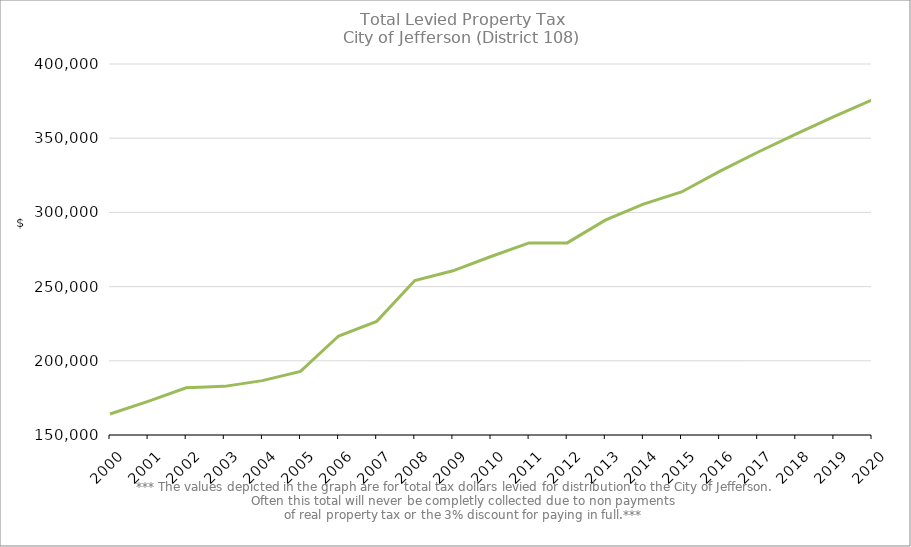
| Category | Series 0 |
|---|---|
| 2000.0 | 164131.67 |
| 2001.0 | 172702.01 |
| 2002.0 | 181807.39 |
| 2003.0 | 182772.2 |
| 2004.0 | 186646.92 |
| 2005.0 | 192885.17 |
| 2006.0 | 216720.46 |
| 2007.0 | 226575.3 |
| 2008.0 | 254103.11 |
| 2009.0 | 260648.68 |
| 2010.0 | 270281.43 |
| 2011.0 | 279451.26 |
| 2012.0 | 279451.26 |
| 2013.0 | 294778.98 |
| 2014.0 | 305628.1 |
| 2015.0 | 313778.6 |
| 2016.0 | 327620.32 |
| 2017.0 | 340541.92 |
| 2018.0 | 352687.05 |
| 2019.0 | 364540.66 |
| 2020.0 | 375744.91 |